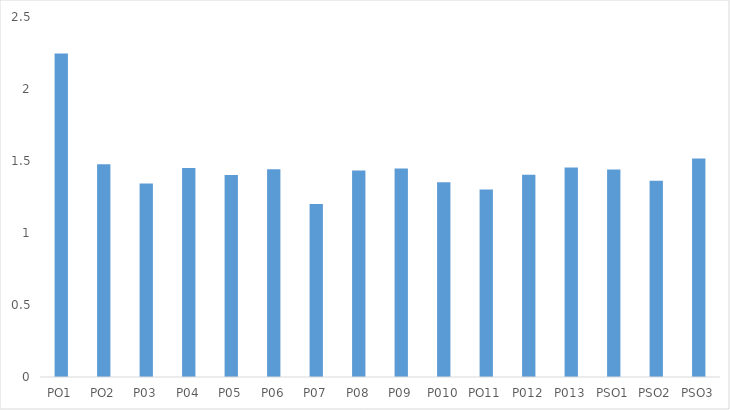
| Category | Series 0 |
|---|---|
| PO1 | 2.247 |
| PO2 | 1.477 |
| P03 | 1.343 |
| P04 | 1.451 |
| P05 | 1.402 |
| P06 | 1.442 |
| P07 | 1.202 |
| P08 | 1.434 |
| P09 | 1.448 |
| P010 | 1.352 |
| PO11 | 1.303 |
| P012 | 1.404 |
| P013 | 1.454 |
| PSO1 | 1.441 |
| PSO2 | 1.362 |
| PSO3 | 1.517 |